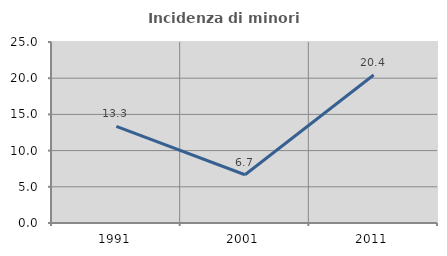
| Category | Incidenza di minori stranieri |
|---|---|
| 1991.0 | 13.333 |
| 2001.0 | 6.667 |
| 2011.0 | 20.442 |